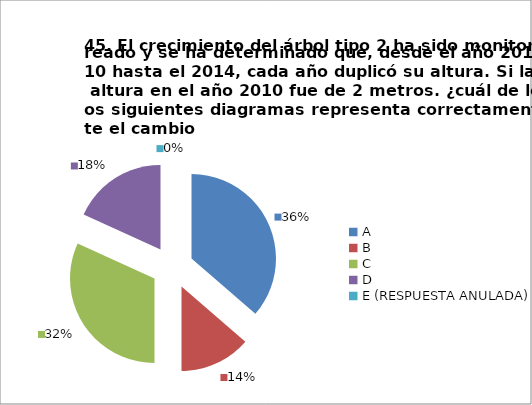
| Category | CANTIDAD DE RESPUESTAS PREGUNTA (45) | PORCENTAJE |
|---|---|---|
| A | 8 | 0.364 |
| B | 3 | 0.136 |
| C | 7 | 0.318 |
| D | 4 | 0.182 |
| E (RESPUESTA ANULADA) | 0 | 0 |